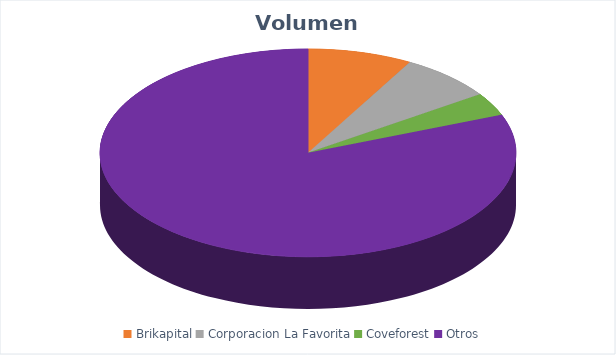
| Category | VOLUMEN ($USD) |
|---|---|
| Brikapital | 30000 |
| Corporacion La Favorita | 27114.27 |
| Coveforest | 13080.6 |
| Otros | 298987.5 |